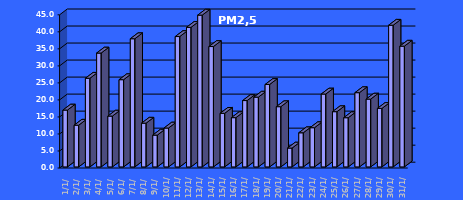
| Category | PM2,5 [µg/m3] |
|---|---|
| 2023-01-01 | 16.7 |
| 2023-01-02 | 12.255 |
| 2023-01-03 | 26.039 |
| 2023-01-04 | 33.445 |
| 2023-01-05 | 14.931 |
| 2023-01-06 | 25.626 |
| 2023-01-07 | 37.654 |
| 2023-01-08 | 12.845 |
| 2023-01-09 | 9.343 |
| 2023-01-10 | 11.421 |
| 2023-01-11 | 38.296 |
| 2023-01-12 | 40.992 |
| 2023-01-13 | 44.585 |
| 2023-01-14 | 35.359 |
| 2023-01-15 | 15.747 |
| 2023-01-16 | 14.471 |
| 2023-01-17 | 19.49 |
| 2023-01-18 | 20.495 |
| 2023-01-19 | 24.211 |
| 2023-01-20 | 17.692 |
| 2023-01-21 | 5.533 |
| 2023-01-22 | 10.025 |
| 2023-01-23 | 11.518 |
| 2023-01-24 | 21.404 |
| 2023-01-25 | 16.228 |
| 2023-01-26 | 14.45 |
| 2023-01-27 | 21.811 |
| 2023-01-28 | 19.924 |
| 2023-01-29 | 17.178 |
| 2023-01-30 | 41.618 |
| 2023-01-31 | 35.471 |